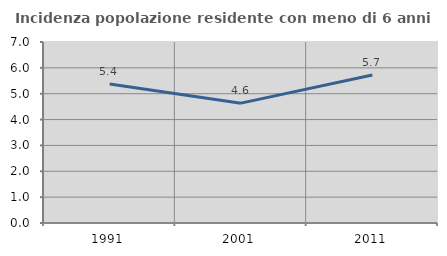
| Category | Incidenza popolazione residente con meno di 6 anni |
|---|---|
| 1991.0 | 5.377 |
| 2001.0 | 4.635 |
| 2011.0 | 5.724 |